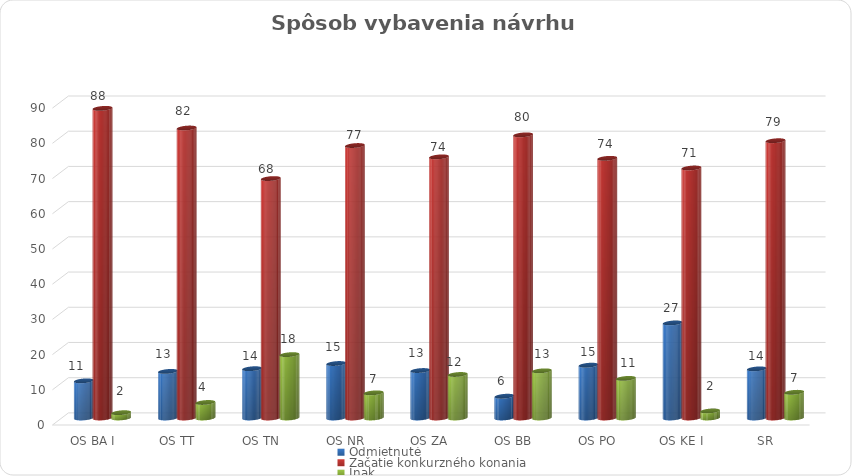
| Category | Odmietnuté | Začatie konkurzného konania  | Inak  |
|---|---|---|---|
| OS BA I | 10.553 | 87.94 | 1.508 |
| OS TT | 13.235 | 82.353 | 4.412 |
| OS TN | 14 | 68 | 18 |
| OS NR | 15.476 | 77.381 | 7.143 |
| OS ZA | 13.483 | 74.157 | 12.36 |
| OS BB | 6.186 | 80.412 | 13.402 |
| OS PO | 15 | 73.75 | 11.25 |
| OS KE I | 27 | 71 | 2 |
| SR | 13.95 | 78.748 | 7.301 |